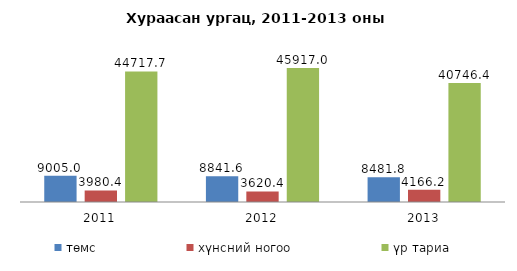
| Category | төмс | хүнсний ногоо | үр тариа |
|---|---|---|---|
| 2011.0 | 9005 | 3980.4 | 44717.7 |
| 2012.0 | 8841.6 | 3620.4 | 45917 |
| 2013.0 | 8481.8 | 4166.2 | 40746.4 |